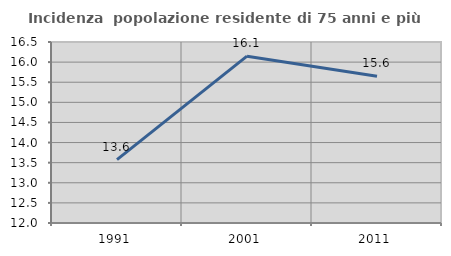
| Category | Incidenza  popolazione residente di 75 anni e più |
|---|---|
| 1991.0 | 13.575 |
| 2001.0 | 16.148 |
| 2011.0 | 15.646 |